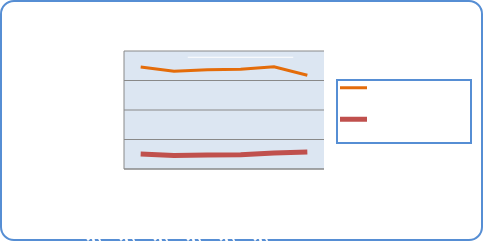
| Category | Motorin Türleri  | Benzin Türleri |
|---|---|---|
| 7/23/18 | 69163749.65 | 10106352.767 |
| 7/24/18 | 66222926.41 | 9218799.183 |
| 7/25/18 | 67226562.538 | 9474664.317 |
| 7/26/18 | 67617450.799 | 9743533.793 |
| 7/27/18 | 69266327.356 | 10796182.011 |
| 7/28/18 | 63559240.011 | 11487189.002 |